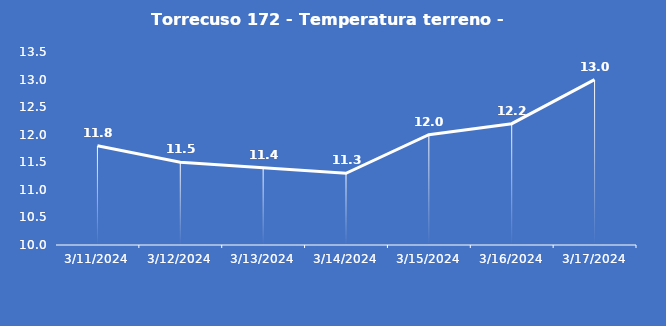
| Category | Torrecuso 172 - Temperatura terreno - Grezzo (°C) |
|---|---|
| 3/11/24 | 11.8 |
| 3/12/24 | 11.5 |
| 3/13/24 | 11.4 |
| 3/14/24 | 11.3 |
| 3/15/24 | 12 |
| 3/16/24 | 12.2 |
| 3/17/24 | 13 |